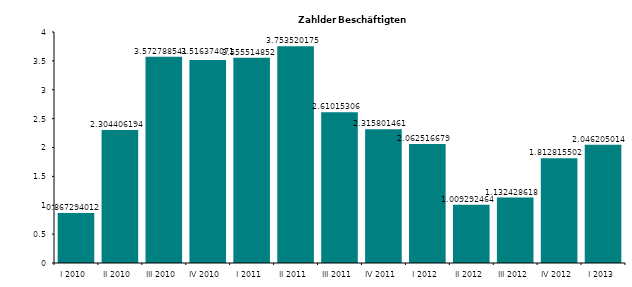
| Category | Series 0 |
|---|---|
| I 2010 | 0.867 |
| II 2010 | 2.304 |
| III 2010 | 3.573 |
| IV 2010 | 3.516 |
| I 2011 | 3.556 |
| II 2011 | 3.754 |
| III 2011 | 2.61 |
| IV 2011 | 2.316 |
| I 2012 | 2.063 |
| II 2012 | 1.009 |
| III 2012 | 1.132 |
| IV 2012 | 1.813 |
| I 2013 | 2.046 |